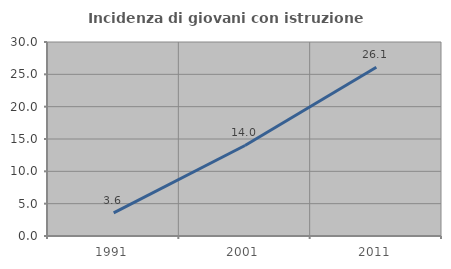
| Category | Incidenza di giovani con istruzione universitaria |
|---|---|
| 1991.0 | 3.571 |
| 2001.0 | 14 |
| 2011.0 | 26.087 |